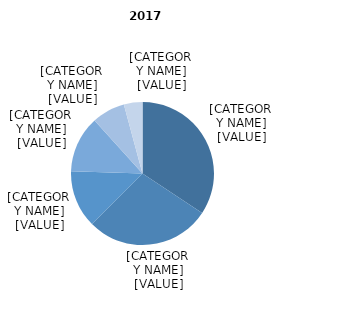
| Category | Series 0 |
|---|---|
| 60-64 ani | 0.343 |
| 65-69 ani | 0.282 |
| 70-74 ani | 0.13 |
| 75-79 ani | 0.128 |
| 80-84 ani | 0.075 |
| 85 ani şi peste | 0.042 |